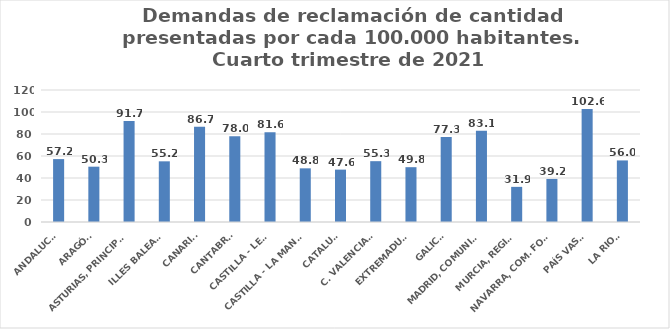
| Category | Series 0 |
|---|---|
| ANDALUCÍA | 57.185 |
| ARAGÓN | 50.292 |
| ASTURIAS, PRINCIPADO | 91.718 |
| ILLES BALEARS | 55.157 |
| CANARIAS | 86.657 |
| CANTABRIA | 78.014 |
| CASTILLA - LEÓN | 81.573 |
| CASTILLA - LA MANCHA | 48.791 |
| CATALUÑA | 47.621 |
| C. VALENCIANA | 55.297 |
| EXTREMADURA | 49.835 |
| GALICIA | 77.347 |
| MADRID, COMUNIDAD | 83.066 |
| MURCIA, REGIÓN | 31.94 |
| NAVARRA, COM. FORAL | 39.151 |
| PAÍS VASCO | 102.62 |
| LA RIOJA | 55.973 |